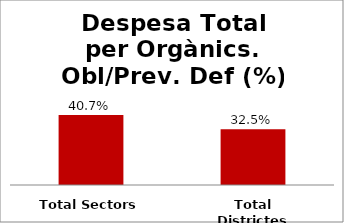
| Category | Series 0 |
|---|---|
| Total Sectors | 0.407 |
| Total Districtes | 0.325 |